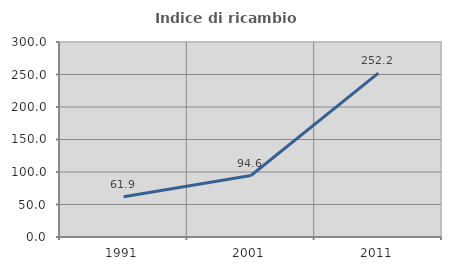
| Category | Indice di ricambio occupazionale  |
|---|---|
| 1991.0 | 61.911 |
| 2001.0 | 94.551 |
| 2011.0 | 252.163 |